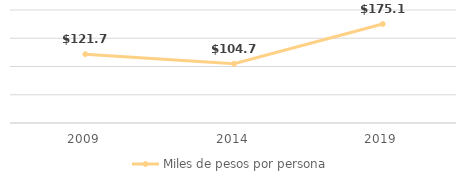
| Category | Miles de pesos por persona |
|---|---|
| 0 | 121.745 |
| 1 | 104.738 |
| 2 | 175.163 |